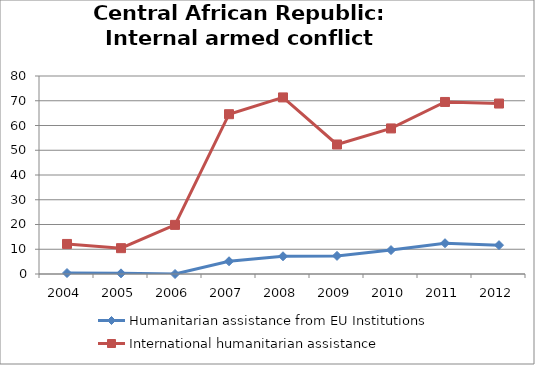
| Category | Humanitarian assistance from EU Institutions | International humanitarian assistance |
|---|---|---|
| 2004.0 | 0.39 | 12.145 |
| 2005.0 | 0.26 | 10.436 |
| 2006.0 | 0 | 19.846 |
| 2007.0 | 5.15 | 64.563 |
| 2008.0 | 7.17 | 71.345 |
| 2009.0 | 7.32 | 52.328 |
| 2010.0 | 9.66 | 58.815 |
| 2011.0 | 12.44 | 69.513 |
| 2012.0 | 11.66 | 68.872 |